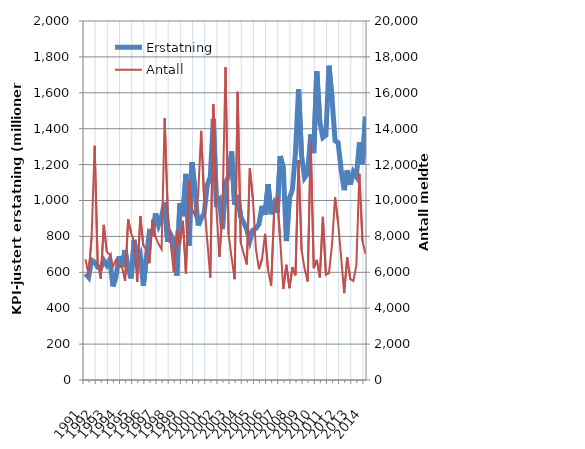
| Category | Erstatning |
|---|---|
| 1991.0 | 591.579 |
| nan | 572.287 |
| nan | 667.746 |
| nan | 656.396 |
| 1992.0 | 628.056 |
| nan | 624.045 |
| nan | 666.31 |
| nan | 639.591 |
| 1993.0 | 671.598 |
| nan | 521.577 |
| nan | 575.46 |
| nan | 688.697 |
| 1994.0 | 630.593 |
| nan | 723.392 |
| nan | 620.001 |
| nan | 566.075 |
| 1995.0 | 780.199 |
| nan | 659.448 |
| nan | 695.815 |
| nan | 524.742 |
| 1996.0 | 683.679 |
| nan | 825.944 |
| nan | 817.707 |
| nan | 927.833 |
| 1997.0 | 862.99 |
| nan | 912.615 |
| nan | 989.399 |
| nan | 769.195 |
| 1998.0 | 810.336 |
| nan | 776.529 |
| nan | 581.982 |
| nan | 984.311 |
| 1999.0 | 912.004 |
| nan | 1148.447 |
| nan | 748.195 |
| nan | 1212.986 |
| 2000.0 | 1051.918 |
| nan | 860.872 |
| nan | 900.019 |
| nan | 928.845 |
| 2001.0 | 1085.732 |
| nan | 1130.17 |
| nan | 1455.22 |
| nan | 991.747 |
| 2002.0 | 1007.298 |
| nan | 840.702 |
| nan | 1096.987 |
| nan | 1134.655 |
| 2003.0 | 1273.143 |
| nan | 977.282 |
| nan | 1031.625 |
| nan | 908.532 |
| 2004.0 | 876.233 |
| nan | 838.217 |
| nan | 775.153 |
| nan | 835.101 |
| 2005.0 | 844.15 |
| nan | 868.456 |
| nan | 970.181 |
| nan | 920.658 |
| 2006.0 | 1090.174 |
| nan | 923.351 |
| nan | 979.214 |
| nan | 931.506 |
| 2007.0 | 1247.432 |
| nan | 1181.709 |
| nan | 774.213 |
| nan | 1012.832 |
| 2008.0 | 1060.83 |
| nan | 1269.18 |
| nan | 1620.539 |
| nan | 1248.372 |
| 2009.0 | 1127.173 |
| nan | 1150.789 |
| nan | 1367.791 |
| nan | 1263.77 |
| 2010.0 | 1718.949 |
| nan | 1438.512 |
| nan | 1350.611 |
| nan | 1363.638 |
| 2011.0 | 1750.887 |
| nan | 1570.857 |
| nan | 1333.081 |
| nan | 1323.348 |
| 2012.0 | 1172.15 |
| nan | 1057.497 |
| nan | 1168.635 |
| nan | 1088.862 |
| 2013.0 | 1158.544 |
| nan | 1132.862 |
| nan | 1323.389 |
| nan | 1202.804 |
| 2014.0 | 1467.42 |